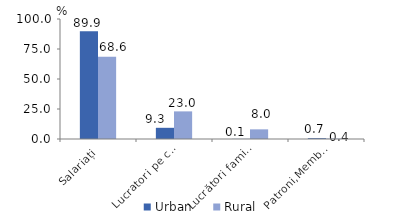
| Category | Urban | Rural |
|---|---|---|
| Salariați | 89.888 | 68.589 |
| Lucratori pe cont propriu | 9.326 | 23.016 |
| Lucrători familiali neremunerați | 0.109 | 8.044 |
| Patroni,Membri ai cooperativei | 0.677 | 0.351 |